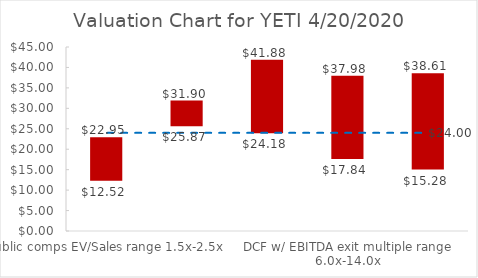
| Category | Series 0 | Series 1 | Series 2 |
|---|---|---|---|
| Public comps EV/Sales range 1.5x-2.5x | 12.517 | 10.433 | 22.95 |
| Public comps P/E range 17.6x-21.7x | 25.872 | 6.027 | 31.899 |
| DCF w/ perpetuity growth range 1.0%-3.5% | 24.181 | 17.704 | 41.885 |
| DCF w/ EBITDA exit multiple range 6.0x-14.0x | 17.839 | 20.138 | 37.976 |
| 52 week high-low | 15.28 | 23.33 | 38.61 |